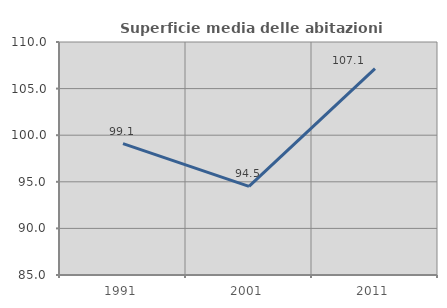
| Category | Superficie media delle abitazioni occupate |
|---|---|
| 1991.0 | 99.088 |
| 2001.0 | 94.51 |
| 2011.0 | 107.143 |